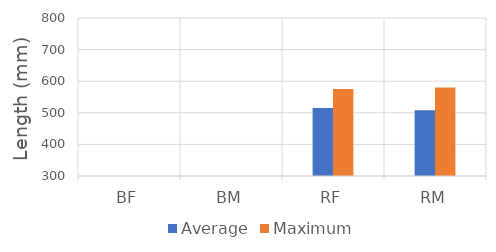
| Category | Average | Maximum |
|---|---|---|
| BF | 0 | 0 |
| BM | 0 | 0 |
| RF | 515 | 575 |
| RM | 508 | 580 |